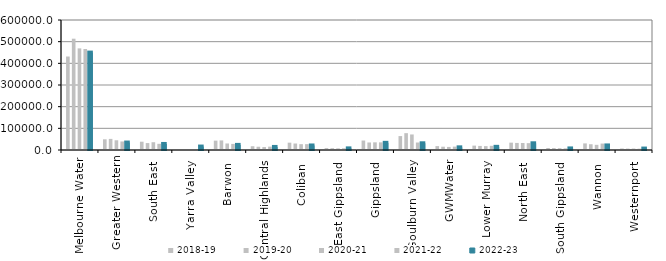
| Category | 2018-19 | 2019-20 | 2020-21 | 2021-22 | 2022-23 |
|---|---|---|---|---|---|
| Melbourne Water | 431455.147 | 513651.425 | 468966.046 | 466284.903 | 449580.584 |
| Greater Western | 49352 | 51237 | 44908 | 39411 | 34440 |
| South East  | 38264 | 32006 | 35856.3 | 28576.5 | 27871 |
| Yarra Valley  | 0 | 0 | 0 | 0 | 15910 |
| Barwon  | 43237.82 | 44258.933 | 30083 | 28166 | 23537.869 |
| Central Highlands  | 17381 | 14976 | 13556.34 | 15484 | 14117 |
| Coliban  | 33856.74 | 29938 | 26942 | 27053.6 | 20904 |
| East Gippsland  | 8872.26 | 8334 | 7636 | 7825 | 7446.9 |
| Gippsland  | 43725 | 34750 | 35385 | 35276 | 33014 |
| Goulburn Valley  | 64229 | 77754 | 71742.29 | 34572 | 30955 |
| GWMWater | 17951.812 | 15168.8 | 14155.1 | 15590.92 | 12264.4 |
| Lower Murray  | 20206.98 | 18837.9 | 17869.98 | 19348 | 14613 |
| North East  | 33905 | 32613.5 | 32197 | 31607 | 30935 |
| South Gippsland  | 9224 | 8874.69 | 8340 | 7580.664 | 7265 |
| Wannon  | 30490 | 26656 | 23887 | 29687 | 21062 |
| Westernport  | 6920 | 6458.7 | 6703.7 | 5973.7 | 6610.18 |